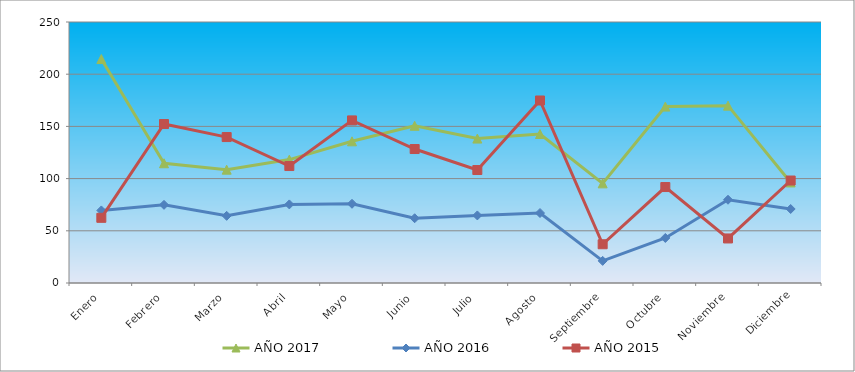
| Category | AÑO 2017 | AÑO 2016 | AÑO 2015 |
|---|---|---|---|
| Enero | 214.516 | 69.518 | 62.433 |
| Febrero | 114.7 | 74.866 | 152.268 |
| Marzo | 108.571 | 64.333 | 139.781 |
| Abril | 118.203 | 75.277 | 112.033 |
| Mayo | 135.714 | 75.889 | 155.736 |
| Junio | 150.599 | 62.021 | 128.335 |
| Julio | 138.341 | 64.718 | 108.217 |
| Agosto | 142.719 | 67.029 | 174.813 |
| Septiembre | 95.438 | 21.187 | 37.113 |
| Octubre | 168.986 | 43.145 | 91.916 |
| Noviembre | 169.862 | 79.742 | 42.663 |
| Diciembre | 96.313 | 70.881 | 98.159 |